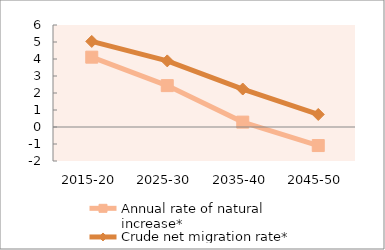
| Category | Annual rate of natural increase* | Crude net migration rate* |
|---|---|---|
| 2015-20 | 4.108 | 5.034 |
| 2025-30 | 2.434 | 3.888 |
| 2035-40 | 0.287 | 2.234 |
| 2045-50 | -1.091 | 0.737 |